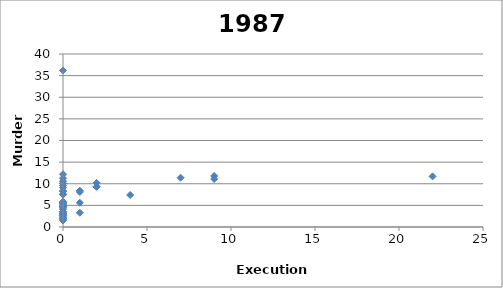
| Category | Series 0 |
|---|---|
| 2.0 | 9.3 |
| 0.0 | 10.1 |
| 0.0 | 7.5 |
| 0.0 | 7.6 |
| 0.0 | 10.6 |
| 0.0 | 5.8 |
| 0.0 | 4.9 |
| 0.0 | 5.1 |
| 0.0 | 36.2 |
| 7.0 | 11.4 |
| 9.0 | 11.8 |
| 0.0 | 4.8 |
| 0.0 | 3.1 |
| 0.0 | 8.3 |
| 1.0 | 5.6 |
| 0.0 | 2.1 |
| 0.0 | 4.4 |
| 0.0 | 7.5 |
| 9.0 | 11.1 |
| 0.0 | 2.5 |
| 0.0 | 9.6 |
| 0.0 | 3 |
| 0.0 | 12.2 |
| 0.0 | 2.6 |
| 2.0 | 10.2 |
| 0.0 | 8.3 |
| 0.0 | 4.1 |
| 0.0 | 3.5 |
| 1.0 | 8.4 |
| 0.0 | 3 |
| 0.0 | 4.6 |
| 0.0 | 10.1 |
| 0.0 | 11.3 |
| 1.0 | 8.1 |
| 0.0 | 1.5 |
| 0.0 | 5.8 |
| 0.0 | 7.5 |
| 0.0 | 5.6 |
| 0.0 | 5.4 |
| 0.0 | 3.5 |
| 2.0 | 9.3 |
| 0.0 | 1.8 |
| 0.0 | 9.1 |
| 22.0 | 11.7 |
| 1.0 | 3.3 |
| 0.0 | 2.7 |
| 4.0 | 7.4 |
| 0.0 | 5.6 |
| 0.0 | 4.8 |
| 0.0 | 3.5 |
| 0.0 | 2 |